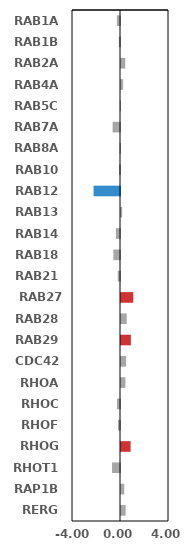
| Category | Series 0 |
|---|---|
| RAB1A | -0.26 |
| RAB1B | -0.096 |
| RAB2A | 0.355 |
| RAB4A | 0.178 |
| RAB5C | -0.006 |
| RAB7A | -0.615 |
| RAB8A | -0.034 |
| RAB10 | -0.084 |
| RAB12 | -2.204 |
| RAB13 | 0.098 |
| RAB14 | -0.345 |
| RAB18 | -0.55 |
| RAB21 | -0.189 |
| RAB27A | 1.025 |
| RAB28 | 0.475 |
| RAB29 | 0.825 |
| CDC42 | 0.429 |
| RHOA | 0.368 |
| RHOC | -0.256 |
| RHOF | -0.17 |
| RHOG | 0.803 |
| RHOT1 | -0.663 |
| RAP1B | 0.271 |
| RERG | 0.389 |